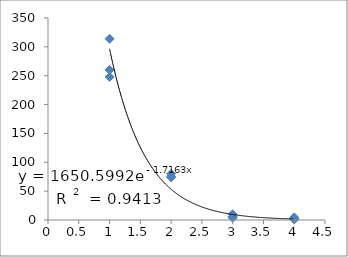
| Category | Series 0 |
|---|---|
| 1.0 | 248 |
| 1.0 | 260 |
| 1.0 | 314 |
| 2.0 | 74 |
| 2.0 | 75 |
| 2.0 | 80 |
| 3.0 | 10 |
| 3.0 | 5.5 |
| 3.0 | 4 |
| 4.0 | 1 |
| 4.0 | 2 |
| 4.0 | 4.5 |